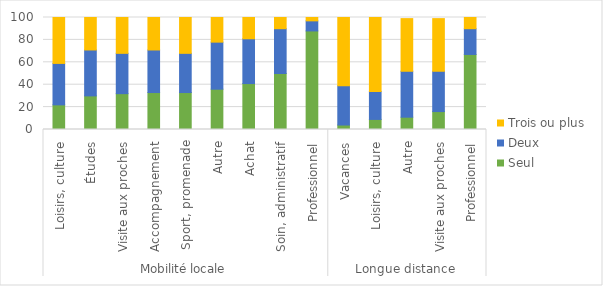
| Category | Seul | Deux | Trois ou plus |
|---|---|---|---|
| 0 | 22 | 37 | 41 |
| 1 | 30 | 41 | 29 |
| 2 | 32 | 36 | 32 |
| 3 | 33 | 38 | 29 |
| 4 | 33 | 35 | 32 |
| 5 | 36 | 42 | 22 |
| 6 | 41 | 40 | 19 |
| 7 | 50 | 40 | 10 |
| 8 | 88 | 9 | 3 |
| 9 | 4 | 35 | 61 |
| 10 | 9 | 25 | 66 |
| 11 | 11 | 41 | 47 |
| 12 | 16 | 36 | 47 |
| 13 | 67 | 23 | 10 |